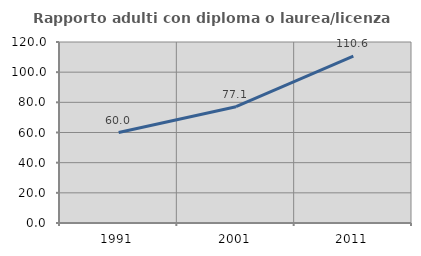
| Category | Rapporto adulti con diploma o laurea/licenza media  |
|---|---|
| 1991.0 | 60 |
| 2001.0 | 77.099 |
| 2011.0 | 110.638 |